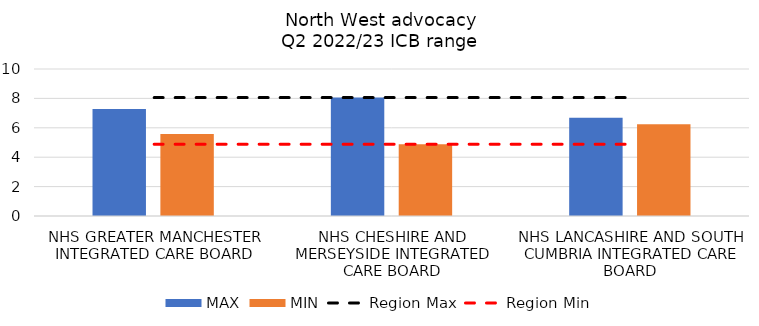
| Category | MAX | MIN |
|---|---|---|
| NHS GREATER MANCHESTER INTEGRATED CARE BOARD | 7.287 | 5.581 |
| NHS CHESHIRE AND MERSEYSIDE INTEGRATED CARE BOARD | 8.056 | 4.881 |
| NHS LANCASHIRE AND SOUTH CUMBRIA INTEGRATED CARE BOARD | 6.687 | 6.24 |